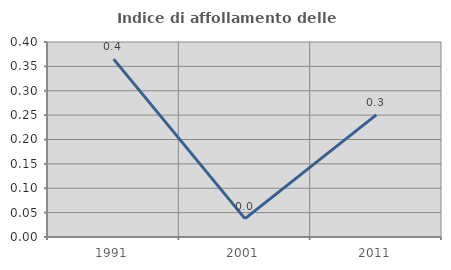
| Category | Indice di affollamento delle abitazioni  |
|---|---|
| 1991.0 | 0.365 |
| 2001.0 | 0.038 |
| 2011.0 | 0.25 |